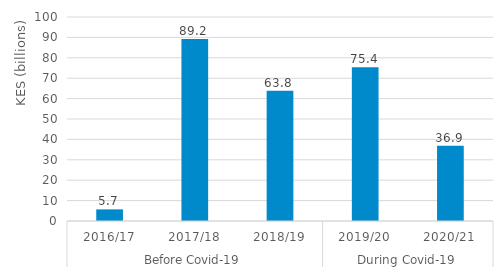
| Category | WASH |
|---|---|
| 0 | 5.7 |
| 1 | 89.2 |
| 2 | 63.8 |
| 3 | 75.406 |
| 4 | 36.943 |